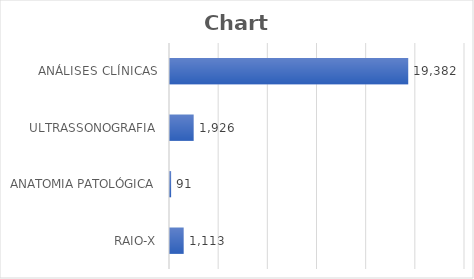
| Category | Series 0 |
|---|---|
| RAIO-X | 1113 |
| ANATOMIA PATOLÓGICA | 91 |
| ULTRASSONOGRAFIA | 1926 |
| ANÁLISES CLÍNICAS | 19382 |